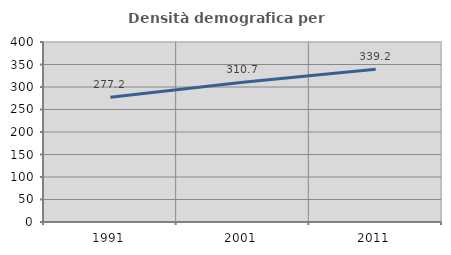
| Category | Densità demografica |
|---|---|
| 1991.0 | 277.236 |
| 2001.0 | 310.679 |
| 2011.0 | 339.212 |